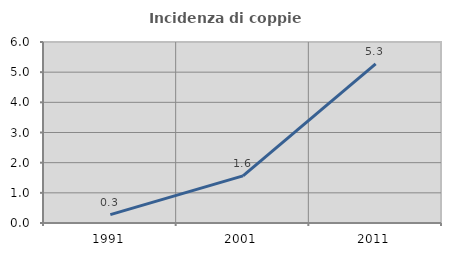
| Category | Incidenza di coppie miste |
|---|---|
| 1991.0 | 0.276 |
| 2001.0 | 1.562 |
| 2011.0 | 5.274 |